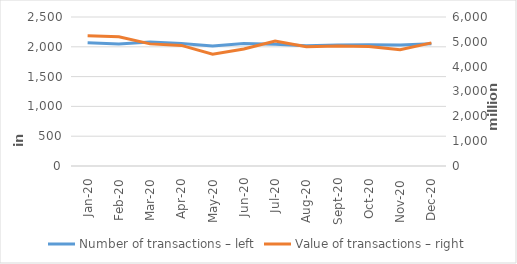
| Category | Number of transactions – left |
|---|---|
| sij.20 | 2069079 |
| Feb-20 | 2045899 |
| ožu.20 | 2080180 |
| tra.20 | 2053561 |
| svi.20 | 2011524 |
| lip.20 | 2054680 |
| srp.20 | 2042820 |
| kol.20 | 2016083 |
| ruj.20 | 2030011 |
| lis.20 | 2035552 |
| stu.20 | 2031822 |
| pro.20 | 2052860 |